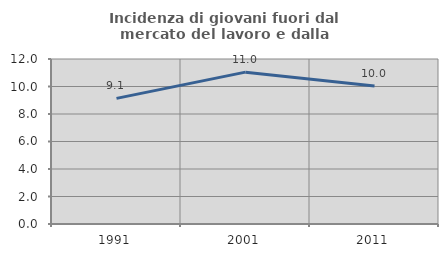
| Category | Incidenza di giovani fuori dal mercato del lavoro e dalla formazione  |
|---|---|
| 1991.0 | 9.135 |
| 2001.0 | 11.044 |
| 2011.0 | 10.031 |